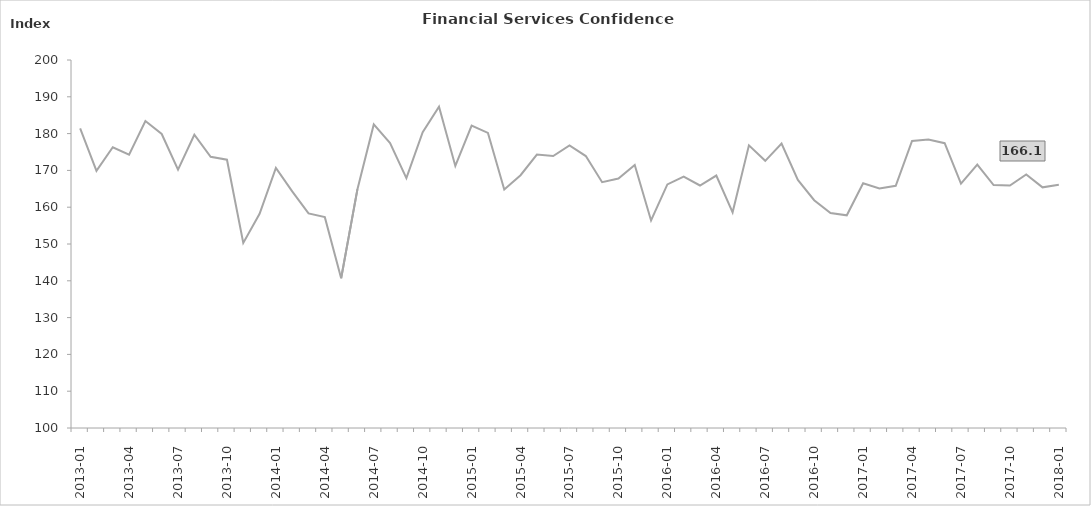
| Category | FSCI |
|---|---|
| 2013-01 | 181.4 |
|  | 169.9 |
|  | 176.3 |
| 2013-04 | 174.3 |
|  | 183.4 |
|  | 179.9 |
| 2013-07 | 170.2 |
|  | 179.7 |
|  | 173.7 |
| 2013-10 | 172.9 |
|  | 150.3 |
|  | 158.2 |
| 2014-01 | 170.7 |
|  | 164.3 |
|  | 158.3 |
| 2014-04 | 157.3 |
|  | 140.7 |
|  | 164.9 |
| 2014-07 | 182.5 |
|  | 177.4 |
|  | 167.9 |
| 2014-10 | 180.4 |
|  | 187.3 |
|  | 171.2 |
| 2015-01 | 182.2 |
|  | 180.2 |
|  | 164.8 |
| 2015-04 | 168.7 |
|  | 174.3 |
|  | 173.9 |
| 2015-07 | 176.8 |
|  | 173.9 |
|  | 166.8 |
| 2015-10 | 167.8 |
|  | 171.5 |
|  | 156.4 |
| 2016-01 | 166.2 |
|  | 168.3 |
|  | 165.9 |
| 2016-04 | 168.6 |
|  | 158.6 |
|  | 176.8 |
| 2016-07 | 172.6 |
|  | 177.3 |
|  | 167.4 |
| 2016-10 | 161.9 |
|  | 158.4 |
|  | 157.8 |
| 2017-01 | 166.5 |
|  | 165.1 |
|  | 165.8 |
| 2017-04 | 178 |
|  | 178.4 |
|  | 177.4 |
| 2017-07 | 166.4 |
|  | 171.6 |
|  | 166 |
| 2017-10 | 165.9 |
|  | 168.9 |
|  | 165.4 |
| 2018-01 | 166.1 |